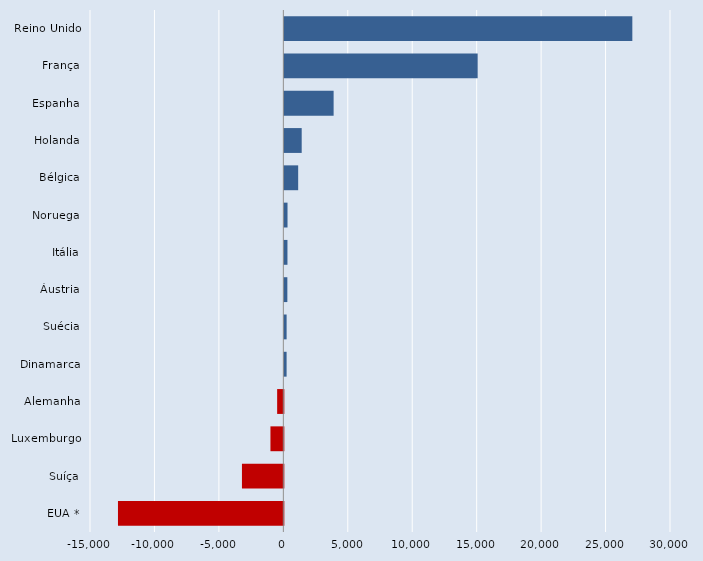
| Category | Series 0 |
|---|---|
| EUA * | -12830 |
| Suíça | -3211 |
| Luxemburgo | -1000 |
| Alemanha | -480 |
| Dinamarca | 176 |
| Suécia | 177 |
| Áustria | 234 |
| Itália | 242 |
| Noruega | 247 |
| Bélgica | 1074 |
| Holanda | 1347 |
| Espanha | 3824 |
| França | 15000 |
| Reino Unido | 27000 |